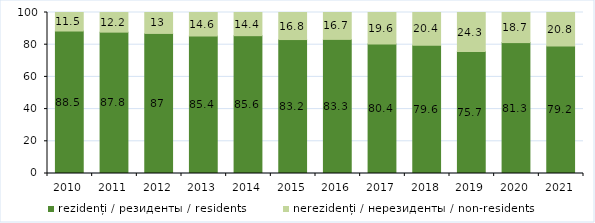
| Category | rezidenți / резиденты / residents | nerezidenți / нерезиденты / non-residents |
|---|---|---|
| 2010.0 | 88.5 | 11.5 |
| 2011.0 | 87.8 | 12.2 |
| 2012.0 | 87 | 13 |
| 2013.0 | 85.4 | 14.6 |
| 2014.0 | 85.6 | 14.4 |
| 2015.0 | 83.2 | 16.8 |
| 2016.0 | 83.3 | 16.7 |
| 2017.0 | 80.4 | 19.6 |
| 2018.0 | 79.6 | 20.4 |
| 2019.0 | 75.7 | 24.3 |
| 2020.0 | 81.3 | 18.7 |
| 2021.0 | 79.2 | 20.8 |